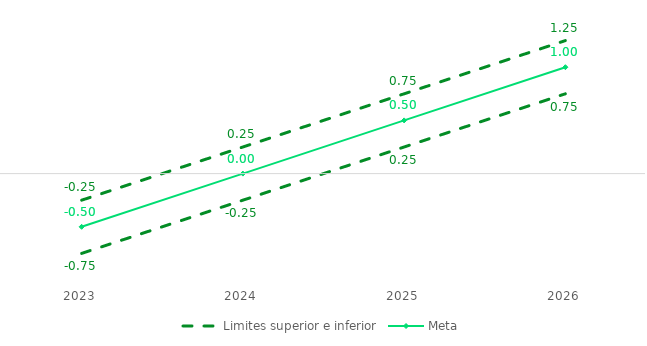
| Category | Limites superior e inferior | Meta | Series 2 |
|---|---|---|---|
| 2023.0 | -0.25 | -0.5 | -0.75 |
| 2024.0 | 0.25 | 0 | -0.25 |
| 2025.0 | 0.75 | 0.5 | 0.25 |
| 2026.0 | 1.25 | 1 | 0.75 |